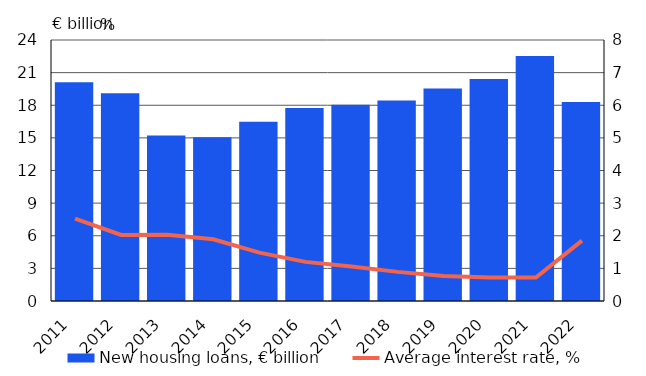
| Category | New housing loans, € billion |
|---|---|
| 2011.0 | 20.124 |
| 2012.0 | 19.114 |
| 2013.0 | 15.22 |
| 2014.0 | 15.052 |
| 2015.0 | 16.482 |
| 2016.0 | 17.75 |
| 2017.0 | 18.04 |
| 2018.0 | 18.442 |
| 2019.0 | 19.547 |
| 2020.0 | 20.424 |
| 2021.0 | 22.533 |
| 2022.0 | 18.299 |